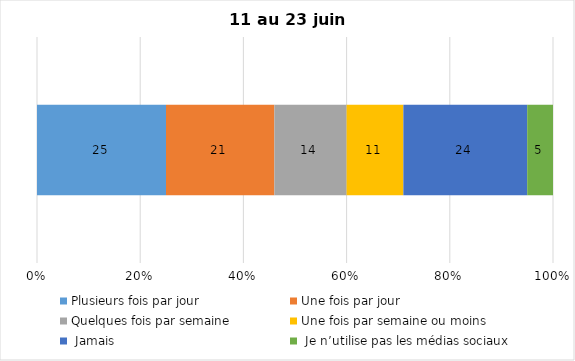
| Category | Plusieurs fois par jour | Une fois par jour | Quelques fois par semaine   | Une fois par semaine ou moins   |  Jamais   |  Je n’utilise pas les médias sociaux |
|---|---|---|---|---|---|---|
| 0 | 25 | 21 | 14 | 11 | 24 | 5 |